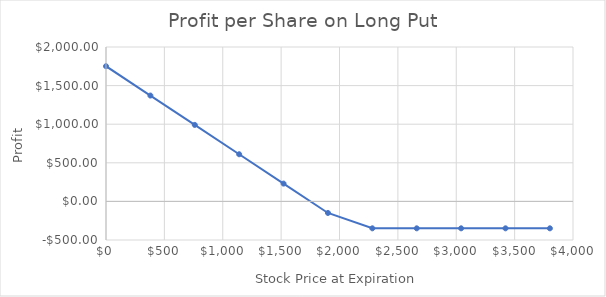
| Category | Profit per Share |
|---|---|
| 0.0 | 1751.3 |
| 380.21000000000004 | 1371.09 |
| 760.4200000000001 | 990.88 |
| 1140.6299999999999 | 610.67 |
| 1520.8400000000001 | 230.46 |
| 1901.05 | -149.75 |
| 2281.2599999999998 | -348.7 |
| 2661.47 | -348.7 |
| 3041.6800000000003 | -348.7 |
| 3421.89 | -348.7 |
| 3802.1 | -348.7 |